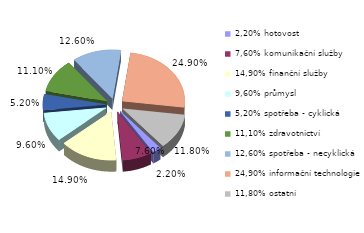
| Category | Series 0 |
|---|---|
| 2,20% hotovost | 0.022 |
| 7,60% komunikační služby | 0.076 |
| 14,90% finanční služby | 0.149 |
| 9,60% průmysl | 0.096 |
| 5,20% spotřeba - cyklická | 0.052 |
| 11,10% zdravotnictví | 0.111 |
| 12,60% spotřeba - necyklická | 0.126 |
| 24,90% informační technologie | 0.249 |
| 11,80% ostatní | 0.118 |